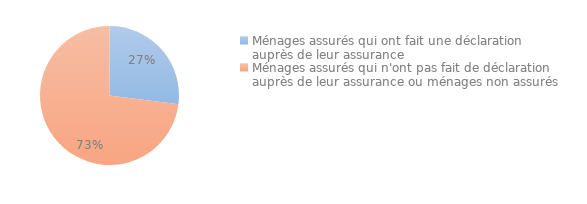
| Category | Series 0 |
|---|---|
| Ménages assurés qui ont fait une déclaration auprès de leur assurance | 0.27 |
| Ménages assurés qui n'ont pas fait de déclaration auprès de leur assurance ou ménages non assurés | 0.73 |
| NSP | 0 |
| NSP | 0 |